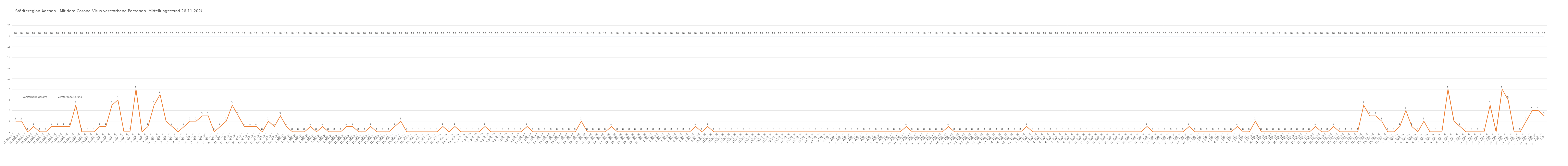
| Category | Verstorbene gesamt | Verstorbene Corona |
|---|---|---|
| 0 | 18 | 2 |
| 1 | 18 | 2 |
| 2 | 18 | 0 |
| 3 | 18 | 1 |
| 4 | 18 | 0 |
| 5 | 18 | 0 |
| 6 | 18 | 1 |
| 7 | 18 | 1 |
| 8 | 18 | 1 |
| 9 | 18 | 1 |
| 10 | 18 | 5 |
| 11 | 18 | 0 |
| 12 | 18 | 0 |
| 13 | 18 | 0 |
| 14 | 18 | 1 |
| 15 | 18 | 1 |
| 16 | 18 | 5 |
| 17 | 18 | 6 |
| 18 | 18 | 0 |
| 19 | 18 | 0 |
| 20 | 18 | 8 |
| 21 | 18 | 0 |
| 22 | 18 | 1 |
| 23 | 18 | 5 |
| 24 | 18 | 7 |
| 25 | 18 | 2 |
| 26 | 18 | 1 |
| 27 | 18 | 0 |
| 28 | 18 | 1 |
| 29 | 18 | 2 |
| 30 | 18 | 2 |
| 31 | 18 | 3 |
| 32 | 18 | 3 |
| 33 | 18 | 0 |
| 34 | 18 | 1 |
| 35 | 18 | 2 |
| 36 | 18 | 5 |
| 37 | 18 | 3 |
| 38 | 18 | 1 |
| 39 | 18 | 1 |
| 40 | 18 | 1 |
| 41 | 18 | 0 |
| 42 | 18 | 2 |
| 43 | 18 | 1 |
| 44 | 18 | 3 |
| 45 | 18 | 1 |
| 46 | 18 | 0 |
| 47 | 18 | 0 |
| 48 | 18 | 0 |
| 49 | 18 | 1 |
| 50 | 18 | 0 |
| 51 | 18 | 1 |
| 52 | 18 | 0 |
| 53 | 18 | 0 |
| 54 | 18 | 0 |
| 55 | 18 | 1 |
| 56 | 18 | 1 |
| 57 | 18 | 0 |
| 58 | 18 | 0 |
| 59 | 18 | 1 |
| 60 | 18 | 0 |
| 61 | 18 | 0 |
| 62 | 18 | 0 |
| 63 | 18 | 1 |
| 64 | 18 | 2 |
| 65 | 18 | 0 |
| 66 | 18 | 0 |
| 67 | 18 | 0 |
| 68 | 18 | 0 |
| 69 | 18 | 0 |
| 70 | 18 | 0 |
| 71 | 18 | 1 |
| 72 | 18 | 0 |
| 73 | 18 | 1 |
| 74 | 18 | 0 |
| 75 | 18 | 0 |
| 76 | 18 | 0 |
| 77 | 18 | 0 |
| 78 | 18 | 1 |
| 79 | 18 | 0 |
| 80 | 18 | 0 |
| 81 | 18 | 0 |
| 82 | 18 | 0 |
| 83 | 18 | 0 |
| 84 | 18 | 0 |
| 85 | 18 | 1 |
| 86 | 18 | 0 |
| 87 | 18 | 0 |
| 88 | 18 | 0 |
| 89 | 18 | 0 |
| 90 | 18 | 0 |
| 91 | 18 | 0 |
| 92 | 18 | 0 |
| 93 | 18 | 0 |
| 94 | 18 | 2 |
| 95 | 18 | 0 |
| 96 | 18 | 0 |
| 97 | 18 | 0 |
| 98 | 18 | 0 |
| 99 | 18 | 1 |
| 100 | 18 | 0 |
| 101 | 18 | 0 |
| 102 | 18 | 0 |
| 103 | 18 | 0 |
| 104 | 18 | 0 |
| 105 | 18 | 0 |
| 106 | 18 | 0 |
| 107 | 18 | 0 |
| 108 | 18 | 0 |
| 109 | 18 | 0 |
| 110 | 18 | 0 |
| 111 | 18 | 0 |
| 112 | 18 | 0 |
| 113 | 18 | 1 |
| 114 | 18 | 0 |
| 115 | 18 | 1 |
| 116 | 18 | 0 |
| 117 | 18 | 0 |
| 118 | 18 | 0 |
| 119 | 18 | 0 |
| 120 | 18 | 0 |
| 121 | 18 | 0 |
| 122 | 18 | 0 |
| 123 | 18 | 0 |
| 124 | 18 | 0 |
| 125 | 18 | 0 |
| 126 | 18 | 0 |
| 127 | 18 | 0 |
| 128 | 18 | 0 |
| 129 | 18 | 0 |
| 130 | 18 | 0 |
| 131 | 18 | 0 |
| 132 | 18 | 0 |
| 133 | 18 | 0 |
| 134 | 18 | 0 |
| 135 | 18 | 0 |
| 136 | 18 | 0 |
| 137 | 18 | 0 |
| 138 | 18 | 0 |
| 139 | 18 | 0 |
| 140 | 18 | 0 |
| 141 | 18 | 0 |
| 142 | 18 | 0 |
| 143 | 18 | 0 |
| 144 | 18 | 0 |
| 145 | 18 | 0 |
| 146 | 18 | 0 |
| 147 | 18 | 0 |
| 148 | 18 | 1 |
| 149 | 18 | 0 |
| 150 | 18 | 0 |
| 151 | 18 | 0 |
| 152 | 18 | 0 |
| 153 | 18 | 0 |
| 154 | 18 | 0 |
| 155 | 18 | 1 |
| 156 | 18 | 0 |
| 157 | 18 | 0 |
| 158 | 18 | 0 |
| 159 | 18 | 0 |
| 160 | 18 | 0 |
| 161 | 18 | 0 |
| 162 | 18 | 0 |
| 163 | 18 | 0 |
| 164 | 18 | 0 |
| 165 | 18 | 0 |
| 166 | 18 | 0 |
| 167 | 18 | 0 |
| 168 | 18 | 1 |
| 169 | 18 | 0 |
| 170 | 18 | 0 |
| 171 | 18 | 0 |
| 172 | 18 | 0 |
| 173 | 18 | 0 |
| 174 | 18 | 0 |
| 175 | 18 | 0 |
| 176 | 18 | 0 |
| 177 | 18 | 0 |
| 178 | 18 | 0 |
| 179 | 18 | 0 |
| 180 | 18 | 0 |
| 181 | 18 | 0 |
| 182 | 18 | 0 |
| 183 | 18 | 0 |
| 184 | 18 | 0 |
| 185 | 18 | 0 |
| 186 | 18 | 0 |
| 187 | 18 | 0 |
| 188 | 18 | 1 |
| 189 | 18 | 0 |
| 190 | 18 | 0 |
| 191 | 18 | 0 |
| 192 | 18 | 0 |
| 193 | 18 | 0 |
| 194 | 18 | 0 |
| 195 | 18 | 1 |
| 196 | 18 | 0 |
| 197 | 18 | 0 |
| 198 | 18 | 0 |
| 199 | 18 | 0 |
| 200 | 18 | 0 |
| 201 | 18 | 0 |
| 202 | 18 | 0 |
| 203 | 18 | 1 |
| 204 | 18 | 0 |
| 205 | 18 | 0 |
| 206 | 18 | 2 |
| 207 | 18 | 0 |
| 208 | 18 | 0 |
| 209 | 18 | 0 |
| 210 | 18 | 0 |
| 211 | 18 | 0 |
| 212 | 18 | 0 |
| 213 | 18 | 0 |
| 214 | 18 | 0 |
| 215 | 18 | 0 |
| 216 | 18 | 1 |
| 217 | 18 | 0 |
| 218 | 18 | 0 |
| 219 | 18 | 1 |
| 220 | 18 | 0 |
| 221 | 18 | 0 |
| 222 | 18 | 0 |
| 223 | 18 | 0 |
| 224 | 18 | 5 |
| 225 | 18 | 3 |
| 226 | 18 | 3 |
| 227 | 18 | 2 |
| 228 | 18 | 0 |
| 229 | 18 | 0 |
| 230 | 18 | 1 |
| 231 | 18 | 4 |
| 232 | 18 | 1 |
| 233 | 18 | 0 |
| 234 | 18 | 2 |
| 235 | 18 | 0 |
| 236 | 18 | 0 |
| 237 | 18 | 0 |
| 238 | 18 | 8 |
| 239 | 18 | 2 |
| 240 | 18 | 1 |
| 241 | 18 | 0 |
| 242 | 18 | 0 |
| 243 | 18 | 0 |
| 244 | 18 | 0 |
| 245 | 18 | 5 |
| 246 | 18 | 0 |
| 247 | 18 | 8 |
| 248 | 18 | 6 |
| 249 | 18 | 0 |
| 250 | 18 | 0 |
| 251 | 18 | 2 |
| 252 | 18 | 4 |
| 253 | 18 | 4 |
| 254 | 18 | 3 |